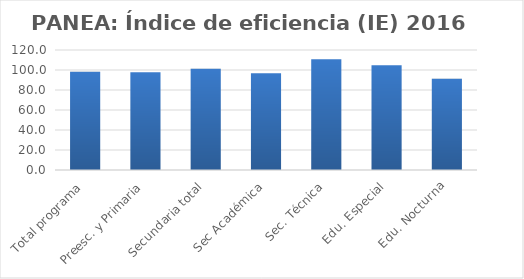
| Category | Índice de eficiencia (IE)  |
|---|---|
| Total programa | 98.373 |
| Preesc. y Primaria | 97.687 |
| Secundaria total | 101.341 |
| Sec Académica | 96.869 |
| Sec. Técnica | 110.678 |
| Edu. Especial | 104.793 |
| Edu. Nocturna | 91.371 |